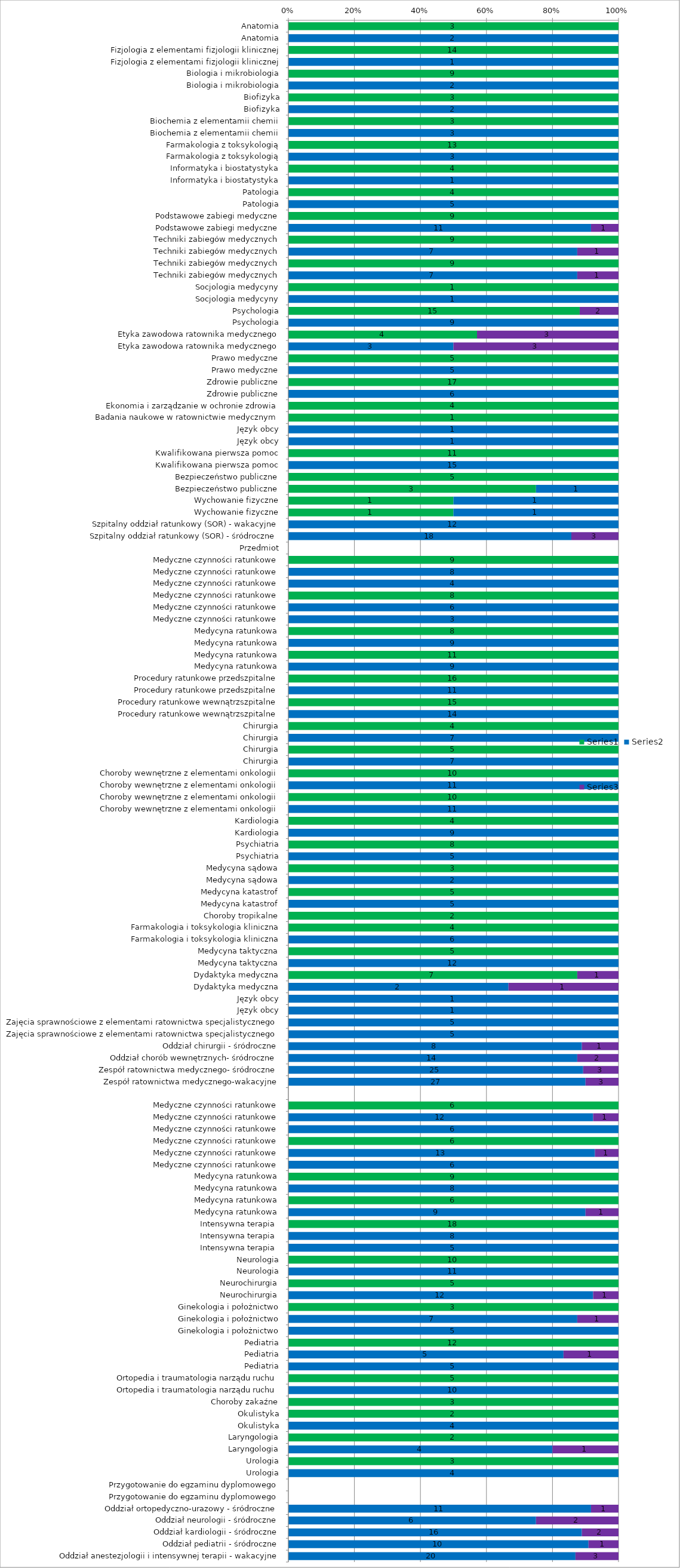
| Category | Series 0 | Series 1 | Series 2 |
|---|---|---|---|
| Anatomia | 3 | 0 | 0 |
| Anatomia | 0 | 2 | 0 |
| Fizjologia z elementami fizjologii klinicznej | 14 | 0 | 0 |
| Fizjologia z elementami fizjologii klinicznej | 0 | 1 | 0 |
| Biologia i mikrobiologia | 9 | 0 | 0 |
| Biologia i mikrobiologia | 0 | 2 | 0 |
| Biofizyka | 3 | 0 | 0 |
| Biofizyka | 0 | 2 | 0 |
| Biochemia z elementamii chemii | 3 | 0 | 0 |
| Biochemia z elementamii chemii | 0 | 3 | 0 |
| Farmakologia z toksykologią | 13 | 0 | 0 |
| Farmakologia z toksykologią | 0 | 3 | 0 |
| Informatyka i biostatystyka | 4 | 0 | 0 |
| Informatyka i biostatystyka | 0 | 1 | 0 |
| Patologia | 4 | 0 | 0 |
| Patologia | 0 | 5 | 0 |
| Podstawowe zabiegi medyczne | 9 | 0 | 0 |
| Podstawowe zabiegi medyczne | 0 | 11 | 1 |
| Techniki zabiegów medycznych | 9 | 0 | 0 |
| Techniki zabiegów medycznych | 0 | 7 | 1 |
| Techniki zabiegów medycznych | 9 | 0 | 0 |
| Techniki zabiegów medycznych | 0 | 7 | 1 |
| Socjologia medycyny | 1 | 0 | 0 |
| Socjologia medycyny | 0 | 1 | 0 |
| Psychologia | 15 | 0 | 2 |
| Psychologia | 0 | 9 | 0 |
| Etyka zawodowa ratownika medycznego | 4 | 0 | 3 |
| Etyka zawodowa ratownika medycznego | 0 | 3 | 3 |
| Prawo medyczne | 5 | 0 | 0 |
| Prawo medyczne | 0 | 5 | 0 |
| Zdrowie publiczne | 17 | 0 | 0 |
| Zdrowie publiczne | 0 | 6 | 0 |
| Ekonomia i zarządzanie w ochronie zdrowia | 4 | 0 | 0 |
| Badania naukowe w ratownictwie medycznym | 1 | 0 | 0 |
| Język obcy | 0 | 1 | 0 |
| Język obcy | 0 | 1 | 0 |
| Kwalifikowana pierwsza pomoc | 11 | 0 | 0 |
| Kwalifikowana pierwsza pomoc | 0 | 15 | 0 |
| Bezpieczeństwo publiczne | 5 | 0 | 0 |
| Bezpieczeństwo publiczne | 3 | 1 | 0 |
| Wychowanie fizyczne | 1 | 1 | 0 |
| Wychowanie fizyczne | 1 | 1 | 0 |
| Szpitalny oddział ratunkowy (SOR) - wakacyjne | 0 | 12 | 0 |
| Szpitalny oddział ratunkowy (SOR) - śródroczne | 0 | 18 | 3 |
| Przedmiot | 0 | 0 | 0 |
| Medyczne czynności ratunkowe | 9 | 0 | 0 |
| Medyczne czynności ratunkowe | 0 | 8 | 0 |
| Medyczne czynności ratunkowe | 0 | 4 | 0 |
| Medyczne czynności ratunkowe | 8 | 0 | 0 |
| Medyczne czynności ratunkowe | 0 | 6 | 0 |
| Medyczne czynności ratunkowe | 0 | 3 | 0 |
| Medycyna ratunkowa | 8 | 0 | 0 |
| Medycyna ratunkowa | 0 | 9 | 0 |
| Medycyna ratunkowa | 11 | 0 | 0 |
| Medycyna ratunkowa | 0 | 9 | 0 |
| Procedury ratunkowe przedszpitalne | 16 | 0 | 0 |
| Procedury ratunkowe przedszpitalne | 0 | 11 | 0 |
| Procedury ratunkowe wewnątrzszpitalne | 15 | 0 | 0 |
| Procedury ratunkowe wewnątrzszpitalne | 0 | 14 | 0 |
| Chirurgia | 4 | 0 | 0 |
| Chirurgia | 0 | 7 | 0 |
| Chirurgia | 5 | 0 | 0 |
| Chirurgia | 0 | 7 | 0 |
| Choroby wewnętrzne z elementami onkologii | 10 | 0 | 0 |
| Choroby wewnętrzne z elementami onkologii | 0 | 11 | 0 |
| Choroby wewnętrzne z elementami onkologii | 10 | 0 | 0 |
| Choroby wewnętrzne z elementami onkologii | 0 | 11 | 0 |
| Kardiologia | 4 | 0 | 0 |
| Kardiologia | 0 | 9 | 0 |
| Psychiatria | 8 | 0 | 0 |
| Psychiatria | 0 | 5 | 0 |
| Medycyna sądowa | 3 | 0 | 0 |
| Medycyna sądowa | 0 | 2 | 0 |
| Medycyna katastrof | 5 | 0 | 0 |
| Medycyna katastrof | 0 | 5 | 0 |
| Choroby tropikalne | 2 | 0 | 0 |
| Farmakologia i toksykologia kliniczna | 4 | 0 | 0 |
| Farmakologia i toksykologia kliniczna | 0 | 6 | 0 |
| Medycyna taktyczna | 5 | 0 | 0 |
| Medycyna taktyczna | 0 | 12 | 0 |
| Dydaktyka medyczna | 7 | 0 | 1 |
| Dydaktyka medyczna | 0 | 2 | 1 |
| Język obcy | 0 | 1 | 0 |
| Język obcy | 0 | 1 | 0 |
| Zajęcia sprawnościowe z elementami ratownictwa specjalistycznego | 0 | 5 | 0 |
| Zajęcia sprawnościowe z elementami ratownictwa specjalistycznego | 0 | 5 | 0 |
| Oddział chirurgii - śródroczne | 0 | 8 | 1 |
| Oddział chorób wewnętrznych- śródroczne | 0 | 14 | 2 |
| Zespół ratownictwa medycznego- śródroczne | 0 | 25 | 3 |
| Zespół ratownictwa medycznego-wakacyjne | 0 | 27 | 3 |
|  | 0 | 0 | 0 |
| Medyczne czynności ratunkowe | 6 | 0 | 0 |
| Medyczne czynności ratunkowe | 0 | 12 | 1 |
| Medyczne czynności ratunkowe | 0 | 6 | 0 |
| Medyczne czynności ratunkowe | 6 | 0 | 0 |
| Medyczne czynności ratunkowe | 0 | 13 | 1 |
| Medyczne czynności ratunkowe | 0 | 6 | 0 |
| Medycyna ratunkowa | 9 | 0 | 0 |
| Medycyna ratunkowa | 0 | 8 | 0 |
| Medycyna ratunkowa | 6 | 0 | 0 |
| Medycyna ratunkowa | 0 | 9 | 1 |
| Intensywna terapia  | 18 | 0 | 0 |
| Intensywna terapia  | 0 | 8 | 0 |
| Intensywna terapia  | 0 | 5 | 0 |
| Neurologia | 10 | 0 | 0 |
| Neurologia | 0 | 11 | 0 |
| Neurochirurgia | 5 | 0 | 0 |
| Neurochirurgia | 0 | 12 | 1 |
| Ginekologia i położnictwo | 3 | 0 | 0 |
| Ginekologia i położnictwo | 0 | 7 | 1 |
| Ginekologia i położnictwo | 0 | 5 | 0 |
| Pediatria | 12 | 0 | 0 |
| Pediatria | 0 | 5 | 1 |
| Pediatria | 0 | 5 | 0 |
| Ortopedia i traumatologia narządu ruchu | 5 | 0 | 0 |
| Ortopedia i traumatologia narządu ruchu | 0 | 10 | 0 |
| Choroby zakaźne | 3 | 0 | 0 |
| Okulistyka | 2 | 0 | 0 |
| Okulistyka | 0 | 4 | 0 |
| Laryngologia | 2 | 0 | 0 |
| Laryngologia | 0 | 4 | 1 |
| Urologia | 3 | 0 | 0 |
| Urologia | 0 | 4 | 0 |
| Przygotowanie do egzaminu dyplomowego | 0 | 0 | 0 |
| Przygotowanie do egzaminu dyplomowego | 0 | 0 | 0 |
| Oddział ortopedyczno-urazowy - śródroczne | 0 | 11 | 1 |
| Oddział neurologii - śródroczne | 0 | 6 | 2 |
| Oddział kardiologii - śródroczne | 0 | 16 | 2 |
| Oddział pediatrii - śródroczne | 0 | 10 | 1 |
| Oddział anestezjologii i intensywnej terapii - wakacyjne | 0 | 20 | 3 |